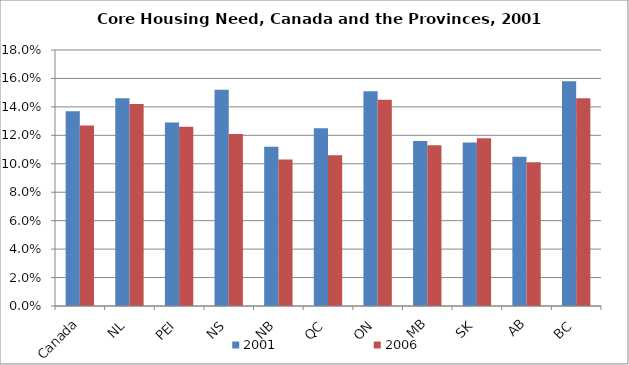
| Category | 2001 | 2006 |
|---|---|---|
| Canada | 0.137 | 0.127 |
| NL | 0.146 | 0.142 |
| PEI | 0.129 | 0.126 |
| NS | 0.152 | 0.121 |
| NB | 0.112 | 0.103 |
| QC | 0.125 | 0.106 |
| ON | 0.151 | 0.145 |
| MB | 0.116 | 0.113 |
| SK | 0.115 | 0.118 |
| AB | 0.105 | 0.101 |
| BC | 0.158 | 0.146 |